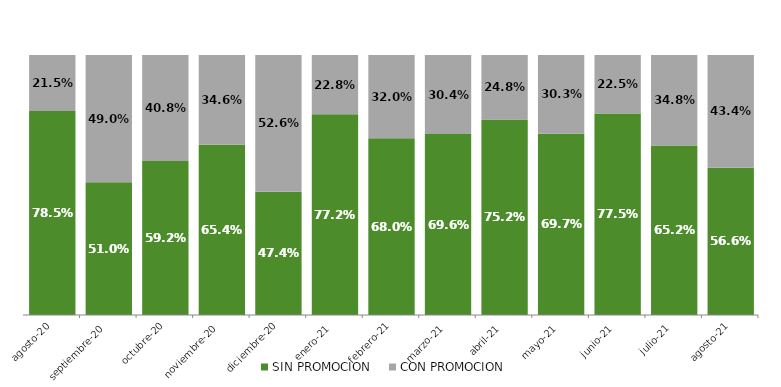
| Category | SIN PROMOCION   | CON PROMOCION   |
|---|---|---|
| 2020-08-01 | 0.785 | 0.215 |
| 2020-09-01 | 0.51 | 0.49 |
| 2020-10-01 | 0.592 | 0.408 |
| 2020-11-01 | 0.654 | 0.346 |
| 2020-12-01 | 0.474 | 0.526 |
| 2021-01-01 | 0.772 | 0.228 |
| 2021-02-01 | 0.68 | 0.32 |
| 2021-03-01 | 0.696 | 0.304 |
| 2021-04-01 | 0.752 | 0.248 |
| 2021-05-01 | 0.697 | 0.303 |
| 2021-06-01 | 0.775 | 0.225 |
| 2021-07-01 | 0.652 | 0.348 |
| 2021-08-01 | 0.566 | 0.434 |